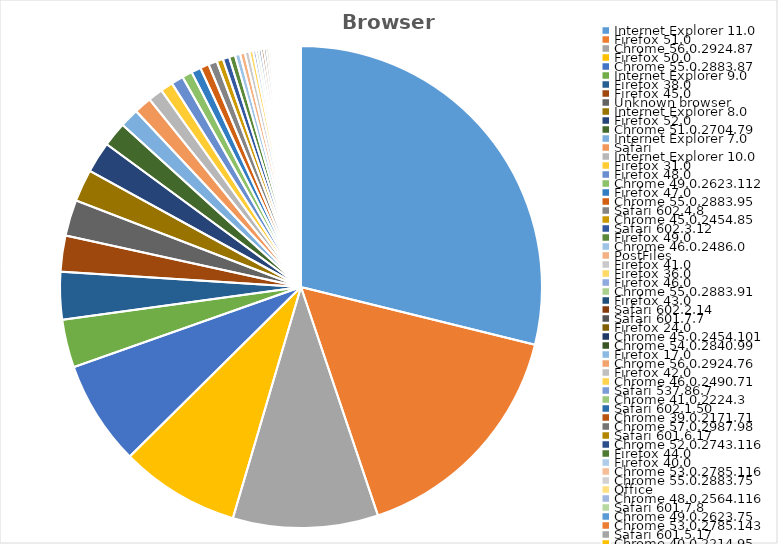
| Category | Series 0 |
|---|---|
| Internet Explorer 11.0 | 569122 |
| Firefox 51.0 | 315290 |
| Chrome 56.0.2924.87 | 192026 |
| Firefox 50.0 | 158156 |
| Chrome 55.0.2883.87 | 138604 |
| Internet Explorer 9.0 | 63643 |
| Firefox 38.0 | 62796 |
| Firefox 45.0 | 47748 |
| Unknown browser | 47563 |
| Internet Explorer 8.0 | 42432 |
| Firefox 52.0 | 41272 |
| Chrome 51.0.2704.79 | 32599 |
| Internet Explorer 7.0 | 24964 |
| Safari | 23326 |
| Internet Explorer 10.0 | 19414 |
| Firefox 31.0 | 16546 |
| Firefox 48.0 | 16058 |
| Chrome 49.0.2623.112 | 13448 |
| Firefox 47.0 | 12656 |
| Chrome 55.0.2883.95 | 11637 |
| Safari 602.4.8 | 11372 |
| Chrome 45.0.2454.85 | 8503 |
| Safari 602.3.12 | 8491 |
| Firefox 49.0 | 7942 |
| Chrome 46.0.2486.0 | 6838 |
| PostFiles | 6433 |
| Firefox 41.0 | 5896 |
| Firefox 36.0 | 5166 |
| Firefox 46.0 | 3796 |
| Chrome 55.0.2883.91 | 3496 |
| Firefox 43.0 | 3416 |
| Safari 602.2.14 | 3414 |
| Safari 601.7.7 | 3375 |
| Firefox 24.0 | 3078 |
| Chrome 45.0.2454.101 | 2824 |
| Chrome 54.0.2840.99 | 2669 |
| Firefox 17.0 | 2604 |
| Chrome 56.0.2924.76 | 2471 |
| Firefox 42.0 | 2238 |
| Chrome 46.0.2490.71 | 2224 |
| Safari 537.86.7 | 2143 |
| Chrome 41.0.2224.3 | 2119 |
| Safari 602.1.50 | 1778 |
| Chrome 39.0.2171.71 | 1762 |
| Chrome 57.0.2987.98 | 1653 |
| Safari 601.6.17 | 1621 |
| Chrome 52.0.2743.116 | 1619 |
| Firefox 44.0 | 1612 |
| Firefox 40.0 | 1604 |
| Chrome 53.0.2785.116 | 1502 |
| Chrome 55.0.2883.75 | 1426 |
| Office | 1414 |
| Chrome 48.0.2564.116 | 1373 |
| Safari 601.7.8 | 1211 |
| Chrome 49.0.2623.75 | 1174 |
| Chrome 53.0.2785.143 | 1154 |
| Safari 601.5.17 | 1142 |
| Chrome 40.0.2214.95 | 1009 |